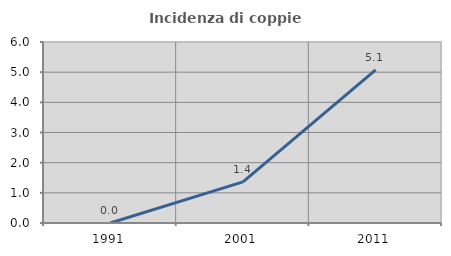
| Category | Incidenza di coppie miste |
|---|---|
| 1991.0 | 0 |
| 2001.0 | 1.362 |
| 2011.0 | 5.078 |